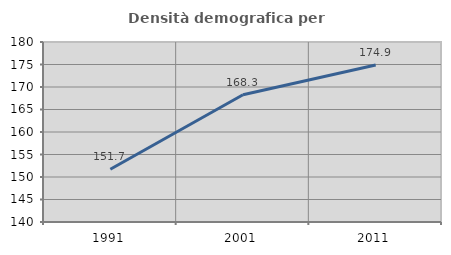
| Category | Densità demografica |
|---|---|
| 1991.0 | 151.727 |
| 2001.0 | 168.268 |
| 2011.0 | 174.885 |